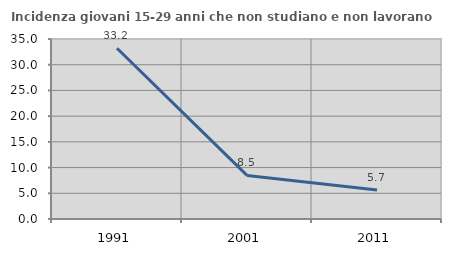
| Category | Incidenza giovani 15-29 anni che non studiano e non lavorano  |
|---|---|
| 1991.0 | 33.2 |
| 2001.0 | 8.475 |
| 2011.0 | 5.66 |